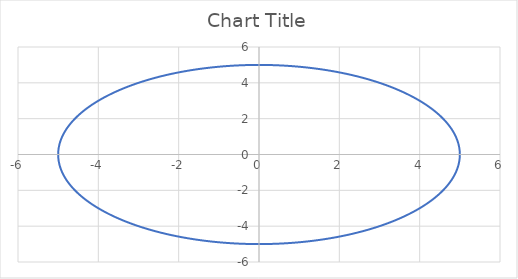
| Category | Series 0 |
|---|---|
| 5.0 | 0 |
| 4.999238475781956 | 0.087 |
| 4.9969541350954785 | 0.174 |
| 4.993147673772869 | 0.262 |
| 4.987820251299121 | 0.349 |
| 4.9809734904587275 | 0.436 |
| 4.972609476841367 | 0.523 |
| 4.96273075820661 | 0.609 |
| 4.951340343707852 | 0.696 |
| 4.938441702975689 | 0.782 |
| 4.92403876506104 | 0.868 |
| 4.90813591723832 | 0.954 |
| 4.8907380036690284 | 1.04 |
| 4.871850323926176 | 1.125 |
| 4.851478631379982 | 1.21 |
| 4.8296291314453415 | 1.294 |
| 4.8063084796915945 | 1.378 |
| 4.781523779815177 | 1.462 |
| 4.755282581475767 | 1.545 |
| 4.727592877996584 | 1.628 |
| 4.698463103929543 | 1.71 |
| 4.667902132486009 | 1.792 |
| 4.635919272833937 | 1.873 |
| 4.6025242672622015 | 1.954 |
| 4.567727288213004 | 2.034 |
| 4.531538935183249 | 2.113 |
| 4.493970231495835 | 2.192 |
| 4.455032620941839 | 2.27 |
| 4.414737964294635 | 2.347 |
| 4.373098535696979 | 2.424 |
| 4.330127018922194 | 2.5 |
| 4.285836503510562 | 2.575 |
| 4.24024048078213 | 2.65 |
| 4.193352839727121 | 2.723 |
| 4.145187862775208 | 2.796 |
| 4.095760221444959 | 2.868 |
| 4.045084971874737 | 2.939 |
| 3.993177550236464 | 3.009 |
| 3.94005376803361 | 3.078 |
| 3.8857298072848545 | 3.147 |
| 3.83022221559489 | 3.214 |
| 3.7735479011138606 | 3.28 |
| 3.715724127386971 | 3.346 |
| 3.656768508095853 | 3.41 |
| 3.596699001693256 | 3.473 |
| 3.5355339059327378 | 3.536 |
| 3.4732918522949867 | 3.597 |
| 3.4099918003124925 | 3.657 |
| 3.345653031794291 | 3.716 |
| 3.2802951449525364 | 3.774 |
| 3.2139380484326967 | 3.83 |
| 3.1466019552491877 | 3.886 |
| 3.0783073766282913 | 3.94 |
| 3.009075115760242 | 3.993 |
| 2.938926261462366 | 4.045 |
| 2.8678821817552307 | 4.096 |
| 2.7959645173537337 | 4.145 |
| 2.723195175075136 | 4.193 |
| 2.6495963211660243 | 4.24 |
| 2.5751903745502718 | 4.286 |
| 2.5000000000000004 | 4.33 |
| 2.4240481012316857 | 4.373 |
| 2.347357813929454 | 4.415 |
| 2.269952498697734 | 4.455 |
| 2.1918557339453875 | 4.494 |
| 2.1130913087034973 | 4.532 |
| 2.033683215379001 | 4.568 |
| 1.9536556424463698 | 4.603 |
| 1.8730329670795598 | 4.636 |
| 1.791839747726502 | 4.668 |
| 1.7101007166283442 | 4.698 |
| 1.6278407722857837 | 4.728 |
| 1.5450849718747373 | 4.755 |
| 1.4618585236136838 | 4.782 |
| 1.3781867790849958 | 4.806 |
| 1.2940952255126037 | 4.83 |
| 1.2096094779983395 | 4.851 |
| 1.1247552717193245 | 4.872 |
| 1.0395584540887972 | 4.891 |
| 0.9540449768827246 | 4.908 |
| 0.8682408883346521 | 4.924 |
| 0.7821723252011547 | 4.938 |
| 0.6958655048003284 | 4.951 |
| 0.6093467170257374 | 4.963 |
| 0.5226423163382673 | 4.973 |
| 0.4357787137382907 | 4.981 |
| 0.3487823687206273 | 4.988 |
| 0.26167978121471985 | 4.993 |
| 0.1744974835125054 | 4.997 |
| 0.08726203218641689 | 4.999 |
| 3.06287113727155e-16 | 5 |
| -0.08726203218641738 | 4.999 |
| -0.17449748351250366 | 4.997 |
| -0.2616797812147181 | 4.993 |
| -0.3487823687206266 | 4.988 |
| -0.4357787137382912 | 4.981 |
| -0.5226423163382666 | 4.973 |
| -0.6093467170257368 | 4.963 |
| -0.6958655048003268 | 4.951 |
| -0.7821723252011552 | 4.938 |
| -0.8682408883346515 | 4.924 |
| -0.954044976882724 | 4.908 |
| -1.0395584540887957 | 4.891 |
| -1.124755271719324 | 4.872 |
| -1.2096094779983388 | 4.851 |
| -1.2940952255126041 | 4.83 |
| -1.3781867790849953 | 4.806 |
| -1.4618585236136834 | 4.782 |
| -1.5450849718747368 | 4.755 |
| -1.6278407722857822 | 4.728 |
| -1.7101007166283435 | 4.698 |
| -1.7918397477265013 | 4.668 |
| -1.8730329670795602 | 4.636 |
| -1.953655642446368 | 4.603 |
| -2.0336832153790003 | 4.568 |
| -2.113091308703497 | 4.532 |
| -2.1918557339453875 | 4.494 |
| -2.2699524986977333 | 4.455 |
| -2.3473578139294524 | 4.415 |
| -2.4240481012316852 | 4.373 |
| -2.499999999999999 | 4.33 |
| -2.5751903745502713 | 4.286 |
| -2.649596321166024 | 4.24 |
| -2.7231951750751353 | 4.193 |
| -2.7959645173537333 | 4.145 |
| -2.8678821817552294 | 4.096 |
| -2.938926261462365 | 4.045 |
| -3.009075115760242 | 3.993 |
| -3.0783073766282913 | 3.94 |
| -3.1466019552491864 | 3.886 |
| -3.2139380484326967 | 3.83 |
| -3.2802951449525377 | 3.774 |
| -3.345653031794291 | 3.716 |
| -3.4099918003124916 | 3.657 |
| -3.4732918522949854 | 3.597 |
| -3.5355339059327373 | 3.536 |
| -3.596699001693256 | 3.473 |
| -3.656768508095852 | 3.41 |
| -3.71572412738697 | 3.346 |
| -3.77354790111386 | 3.28 |
| -3.8302222155948895 | 3.214 |
| -3.8857298072848536 | 3.147 |
| -3.9400537680336094 | 3.078 |
| -3.9931775502364646 | 3.009 |
| -4.045084971874736 | 2.939 |
| -4.095760221444958 | 2.868 |
| -4.145187862775208 | 2.796 |
| -4.193352839727121 | 2.723 |
| -4.24024048078213 | 2.65 |
| -4.285836503510561 | 2.575 |
| -4.330127018922194 | 2.5 |
| -4.373098535696979 | 2.424 |
| -4.414737964294634 | 2.347 |
| -4.455032620941839 | 2.27 |
| -4.493970231495835 | 2.192 |
| -4.531538935183249 | 2.113 |
| -4.567727288213003 | 2.034 |
| -4.602524267262201 | 1.954 |
| -4.635919272833936 | 1.873 |
| -4.667902132486009 | 1.792 |
| -4.698463103929542 | 1.71 |
| -4.7275928779965835 | 1.628 |
| -4.755282581475767 | 1.545 |
| -4.781523779815177 | 1.462 |
| -4.806308479691594 | 1.378 |
| -4.829629131445341 | 1.294 |
| -4.851478631379982 | 1.21 |
| -4.871850323926176 | 1.125 |
| -4.8907380036690284 | 1.04 |
| -4.90813591723832 | 0.954 |
| -4.92403876506104 | 0.868 |
| -4.938441702975688 | 0.782 |
| -4.951340343707852 | 0.696 |
| -4.96273075820661 | 0.609 |
| -4.972609476841367 | 0.523 |
| -4.9809734904587275 | 0.436 |
| -4.987820251299121 | 0.349 |
| -4.993147673772869 | 0.262 |
| -4.9969541350954785 | 0.174 |
| -4.999238475781956 | 0.087 |
| -5.0 | 0 |
| -4.999238475781956 | -0.087 |
| -4.9969541350954785 | -0.174 |
| -4.993147673772869 | -0.262 |
| -4.987820251299121 | -0.349 |
| -4.9809734904587275 | -0.436 |
| -4.972609476841367 | -0.523 |
| -4.96273075820661 | -0.609 |
| -4.951340343707852 | -0.696 |
| -4.938441702975689 | -0.782 |
| -4.92403876506104 | -0.868 |
| -4.90813591723832 | -0.954 |
| -4.8907380036690284 | -1.04 |
| -4.871850323926176 | -1.125 |
| -4.851478631379982 | -1.21 |
| -4.829629131445342 | -1.294 |
| -4.8063084796915945 | -1.378 |
| -4.781523779815178 | -1.462 |
| -4.755282581475767 | -1.545 |
| -4.7275928779965835 | -1.628 |
| -4.698463103929543 | -1.71 |
| -4.667902132486009 | -1.792 |
| -4.635919272833937 | -1.873 |
| -4.6025242672622015 | -1.954 |
| -4.567727288213005 | -2.034 |
| -4.53153893518325 | -2.113 |
| -4.493970231495836 | -2.192 |
| -4.45503262094184 | -2.27 |
| -4.414737964294634 | -2.347 |
| -4.373098535696979 | -2.424 |
| -4.330127018922193 | -2.5 |
| -4.285836503510562 | -2.575 |
| -4.240240480782131 | -2.65 |
| -4.193352839727121 | -2.723 |
| -4.1451878627752095 | -2.796 |
| -4.09576022144496 | -2.868 |
| -4.045084971874738 | -2.939 |
| -3.9931775502364655 | -3.009 |
| -3.940053768033611 | -3.078 |
| -3.885729807284854 | -3.147 |
| -3.83022221559489 | -3.214 |
| -3.7735479011138597 | -3.28 |
| -3.715724127386971 | -3.346 |
| -3.656768508095853 | -3.41 |
| -3.5966990016932554 | -3.473 |
| -3.5355339059327386 | -3.536 |
| -3.473291852294988 | -3.597 |
| -3.4099918003124947 | -3.657 |
| -3.345653031794292 | -3.716 |
| -3.280295144952538 | -3.774 |
| -3.2139380484326976 | -3.83 |
| -3.146601955249186 | -3.886 |
| -3.0783073766282905 | -3.94 |
| -3.0090751157602416 | -3.993 |
| -2.9389262614623664 | -4.045 |
| -2.867882181755232 | -4.096 |
| -2.7959645173537364 | -4.145 |
| -2.723195175075135 | -4.193 |
| -2.649596321166025 | -4.24 |
| -2.5751903745502727 | -4.286 |
| -2.500000000000002 | -4.33 |
| -2.4240481012316843 | -4.373 |
| -2.3473578139294538 | -4.415 |
| -2.2699524986977346 | -4.455 |
| -2.191855733945389 | -4.494 |
| -2.1130913087035 | -4.532 |
| -2.0336832153790003 | -4.568 |
| -1.9536556424463691 | -4.603 |
| -1.8730329670795616 | -4.636 |
| -1.7918397477265036 | -4.668 |
| -1.7101007166283468 | -4.698 |
| -1.6278407722857833 | -4.728 |
| -1.5450849718747377 | -4.755 |
| -1.4618585236136856 | -4.782 |
| -1.3781867790849944 | -4.806 |
| -1.2940952255126033 | -4.83 |
| -1.2096094779983388 | -4.851 |
| -1.1247552717193263 | -4.872 |
| -1.039558454088799 | -4.891 |
| -0.9540449768827274 | -4.908 |
| -0.8682408883346516 | -4.924 |
| -0.7821723252011552 | -4.938 |
| -0.6958655048003247 | -4.951 |
| -0.6093467170257358 | -4.963 |
| -0.5226423163382667 | -4.973 |
| -0.43577871373829125 | -4.981 |
| -0.3487823687206279 | -4.988 |
| -0.2616797812147215 | -4.993 |
| -0.17449748351250824 | -4.997 |
| -0.08726203218641748 | -4.999 |
| -9.18861341181465e-16 | -5 |
| 0.08726203218641565 | -4.999 |
| 0.1744974835125064 | -4.997 |
| 0.26167978121471974 | -4.993 |
| 0.34878236872062607 | -4.988 |
| 0.43577871373828947 | -4.981 |
| 0.522642316338265 | -4.973 |
| 0.6093467170257384 | -4.963 |
| 0.6958655048003273 | -4.951 |
| 0.7821723252011534 | -4.938 |
| 0.8682408883346499 | -4.924 |
| 0.9540449768827213 | -4.908 |
| 1.0395584540887928 | -4.891 |
| 1.1247552717193245 | -4.872 |
| 1.2096094779983373 | -4.851 |
| 1.2940952255126057 | -4.83 |
| 1.3781867790849969 | -4.806 |
| 1.4618585236136836 | -4.782 |
| 1.5450849718747361 | -4.755 |
| 1.6278407722857815 | -4.728 |
| 1.7101007166283408 | -4.698 |
| 1.7918397477264978 | -4.668 |
| 1.8730329670795598 | -4.636 |
| 1.9536556424463676 | -4.603 |
| 2.0336832153790025 | -4.568 |
| 2.113091308703498 | -4.532 |
| 2.191855733945387 | -4.494 |
| 2.2699524986977333 | -4.455 |
| 2.347357813929452 | -4.415 |
| 2.4240481012316826 | -4.373 |
| 2.5000000000000004 | -4.33 |
| 2.575190374550271 | -4.286 |
| 2.6495963211660234 | -4.24 |
| 2.723195175075133 | -4.193 |
| 2.795964517353731 | -4.145 |
| 2.8678821817552302 | -4.096 |
| 2.9389262614623646 | -4.045 |
| 3.00907511576024 | -3.993 |
| 3.0783073766282927 | -3.94 |
| 3.1466019552491877 | -3.886 |
| 3.2139380484326963 | -3.83 |
| 3.280295144952535 | -3.774 |
| 3.345653031794289 | -3.716 |
| 3.4099918003124903 | -3.657 |
| 3.4732918522949827 | -3.597 |
| 3.535533905932737 | -3.536 |
| 3.5966990016932545 | -3.473 |
| 3.6567685080958534 | -3.41 |
| 3.715724127386971 | -3.346 |
| 3.7735479011138597 | -3.28 |
| 3.830222215594889 | -3.214 |
| 3.8857298072848527 | -3.147 |
| 3.940053768033608 | -3.078 |
| 3.993177550236464 | -3.009 |
| 4.045084971874736 | -2.939 |
| 4.095760221444958 | -2.868 |
| 4.145187862775207 | -2.796 |
| 4.193352839727121 | -2.723 |
| 4.240240480782127 | -2.65 |
| 4.285836503510561 | -2.575 |
| 4.330127018922192 | -2.5 |
| 4.373098535696979 | -2.424 |
| 4.414737964294634 | -2.347 |
| 4.455032620941839 | -2.27 |
| 4.493970231495836 | -2.192 |
| 4.5315389351832485 | -2.113 |
| 4.567727288213005 | -2.034 |
| 4.6025242672622 | -1.954 |
| 4.635919272833936 | -1.873 |
| 4.667902132486008 | -1.792 |
| 4.698463103929543 | -1.71 |
| 4.727592877996583 | -1.628 |
| 4.755282581475767 | -1.545 |
| 4.781523779815179 | -1.462 |
| 4.806308479691594 | -1.378 |
| 4.8296291314453415 | -1.294 |
| 4.851478631379982 | -1.21 |
| 4.871850323926176 | -1.125 |
| 4.890738003669028 | -1.04 |
| 4.90813591723832 | -0.954 |
| 4.92403876506104 | -0.868 |
| 4.938441702975688 | -0.782 |
| 4.951340343707852 | -0.696 |
| 4.96273075820661 | -0.609 |
| 4.972609476841367 | -0.523 |
| 4.9809734904587275 | -0.436 |
| 4.987820251299121 | -0.349 |
| 4.993147673772869 | -0.262 |
| 4.9969541350954785 | -0.174 |
| 4.999238475781956 | -0.087 |
| 5.0 | 0 |